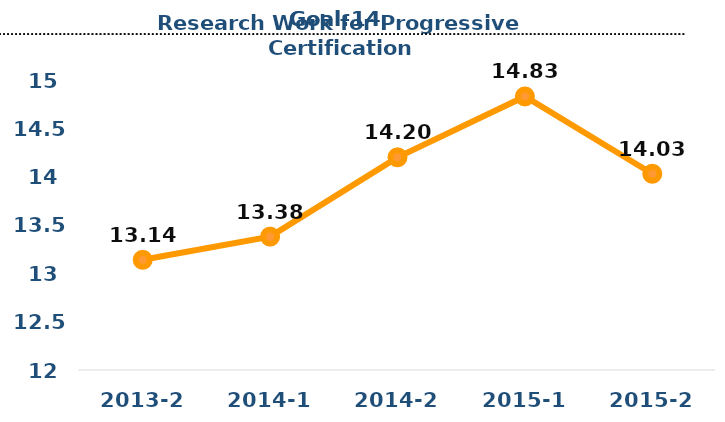
| Category | Series 0 |
|---|---|
| 2013-2 | 13.14 |
| 2014-1 | 13.38 |
| 2014-2 | 14.2 |
| 2015-1 | 14.83 |
| 2015-2 | 14.03 |